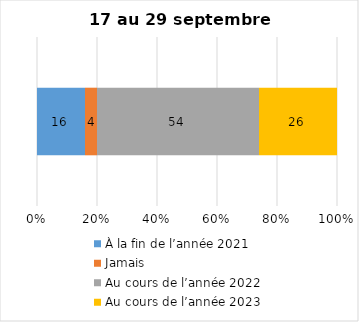
| Category | À la fin de l’année 2021 | Jamais | Au cours de l’année 2022 | Au cours de l’année 2023 |
|---|---|---|---|---|
| 0 | 16 | 4 | 54 | 26 |